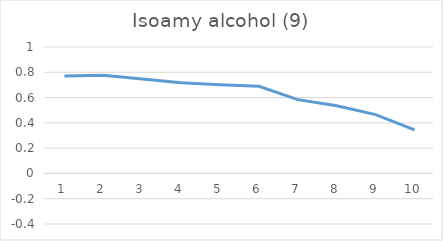
| Category | Series 0 |
|---|---|
| 0 | 0.771 |
| 1 | 0.776 |
| 2 | 0.747 |
| 3 | 0.718 |
| 4 | 0.701 |
| 5 | 0.689 |
| 6 | 0.584 |
| 7 | 0.535 |
| 8 | 0.465 |
| 9 | 0.344 |